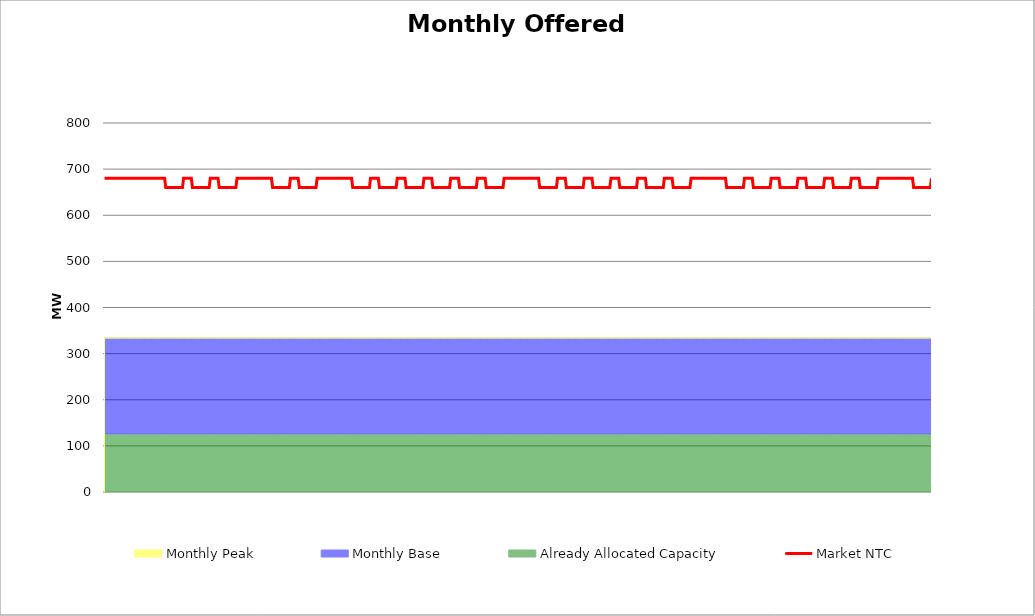
| Category | Market NTC |
|---|---|
| 0 | 680 |
| 1 | 680 |
| 2 | 680 |
| 3 | 680 |
| 4 | 680 |
| 5 | 680 |
| 6 | 680 |
| 7 | 680 |
| 8 | 680 |
| 9 | 680 |
| 10 | 680 |
| 11 | 680 |
| 12 | 680 |
| 13 | 680 |
| 14 | 680 |
| 15 | 680 |
| 16 | 680 |
| 17 | 680 |
| 18 | 680 |
| 19 | 680 |
| 20 | 680 |
| 21 | 680 |
| 22 | 680 |
| 23 | 680 |
| 24 | 680 |
| 25 | 680 |
| 26 | 680 |
| 27 | 680 |
| 28 | 680 |
| 29 | 680 |
| 30 | 680 |
| 31 | 680 |
| 32 | 680 |
| 33 | 680 |
| 34 | 680 |
| 35 | 680 |
| 36 | 680 |
| 37 | 680 |
| 38 | 680 |
| 39 | 680 |
| 40 | 680 |
| 41 | 680 |
| 42 | 680 |
| 43 | 680 |
| 44 | 680 |
| 45 | 680 |
| 46 | 680 |
| 47 | 680 |
| 48 | 680 |
| 49 | 680 |
| 50 | 680 |
| 51 | 680 |
| 52 | 680 |
| 53 | 680 |
| 54 | 680 |
| 55 | 660 |
| 56 | 660 |
| 57 | 660 |
| 58 | 660 |
| 59 | 660 |
| 60 | 660 |
| 61 | 660 |
| 62 | 660 |
| 63 | 660 |
| 64 | 660 |
| 65 | 660 |
| 66 | 660 |
| 67 | 660 |
| 68 | 660 |
| 69 | 660 |
| 70 | 660 |
| 71 | 680 |
| 72 | 680 |
| 73 | 680 |
| 74 | 680 |
| 75 | 680 |
| 76 | 680 |
| 77 | 680 |
| 78 | 680 |
| 79 | 660 |
| 80 | 660 |
| 81 | 660 |
| 82 | 660 |
| 83 | 660 |
| 84 | 660 |
| 85 | 660 |
| 86 | 660 |
| 87 | 660 |
| 88 | 660 |
| 89 | 660 |
| 90 | 660 |
| 91 | 660 |
| 92 | 660 |
| 93 | 660 |
| 94 | 660 |
| 95 | 680 |
| 96 | 680 |
| 97 | 680 |
| 98 | 680 |
| 99 | 680 |
| 100 | 680 |
| 101 | 680 |
| 102 | 680 |
| 103 | 660 |
| 104 | 660 |
| 105 | 660 |
| 106 | 660 |
| 107 | 660 |
| 108 | 660 |
| 109 | 660 |
| 110 | 660 |
| 111 | 660 |
| 112 | 660 |
| 113 | 660 |
| 114 | 660 |
| 115 | 660 |
| 116 | 660 |
| 117 | 660 |
| 118 | 660 |
| 119 | 680 |
| 120 | 680 |
| 121 | 680 |
| 122 | 680 |
| 123 | 680 |
| 124 | 680 |
| 125 | 680 |
| 126 | 680 |
| 127 | 680 |
| 128 | 680 |
| 129 | 680 |
| 130 | 680 |
| 131 | 680 |
| 132 | 680 |
| 133 | 680 |
| 134 | 680 |
| 135 | 680 |
| 136 | 680 |
| 137 | 680 |
| 138 | 680 |
| 139 | 680 |
| 140 | 680 |
| 141 | 680 |
| 142 | 680 |
| 143 | 680 |
| 144 | 680 |
| 145 | 680 |
| 146 | 680 |
| 147 | 680 |
| 148 | 680 |
| 149 | 680 |
| 150 | 680 |
| 151 | 660 |
| 152 | 660 |
| 153 | 660 |
| 154 | 660 |
| 155 | 660 |
| 156 | 660 |
| 157 | 660 |
| 158 | 660 |
| 159 | 660 |
| 160 | 660 |
| 161 | 660 |
| 162 | 660 |
| 163 | 660 |
| 164 | 660 |
| 165 | 660 |
| 166 | 660 |
| 167 | 680 |
| 168 | 680 |
| 169 | 680 |
| 170 | 680 |
| 171 | 680 |
| 172 | 680 |
| 173 | 680 |
| 174 | 680 |
| 175 | 660 |
| 176 | 660 |
| 177 | 660 |
| 178 | 660 |
| 179 | 660 |
| 180 | 660 |
| 181 | 660 |
| 182 | 660 |
| 183 | 660 |
| 184 | 660 |
| 185 | 660 |
| 186 | 660 |
| 187 | 660 |
| 188 | 660 |
| 189 | 660 |
| 190 | 660 |
| 191 | 680 |
| 192 | 680 |
| 193 | 680 |
| 194 | 680 |
| 195 | 680 |
| 196 | 680 |
| 197 | 680 |
| 198 | 680 |
| 199 | 680 |
| 200 | 680 |
| 201 | 680 |
| 202 | 680 |
| 203 | 680 |
| 204 | 680 |
| 205 | 680 |
| 206 | 680 |
| 207 | 680 |
| 208 | 680 |
| 209 | 680 |
| 210 | 680 |
| 211 | 680 |
| 212 | 680 |
| 213 | 680 |
| 214 | 680 |
| 215 | 680 |
| 216 | 680 |
| 217 | 680 |
| 218 | 680 |
| 219 | 680 |
| 220 | 680 |
| 221 | 680 |
| 222 | 680 |
| 223 | 660 |
| 224 | 660 |
| 225 | 660 |
| 226 | 660 |
| 227 | 660 |
| 228 | 660 |
| 229 | 660 |
| 230 | 660 |
| 231 | 660 |
| 232 | 660 |
| 233 | 660 |
| 234 | 660 |
| 235 | 660 |
| 236 | 660 |
| 237 | 660 |
| 238 | 660 |
| 239 | 680 |
| 240 | 680 |
| 241 | 680 |
| 242 | 680 |
| 243 | 680 |
| 244 | 680 |
| 245 | 680 |
| 246 | 680 |
| 247 | 660 |
| 248 | 660 |
| 249 | 660 |
| 250 | 660 |
| 251 | 660 |
| 252 | 660 |
| 253 | 660 |
| 254 | 660 |
| 255 | 660 |
| 256 | 660 |
| 257 | 660 |
| 258 | 660 |
| 259 | 660 |
| 260 | 660 |
| 261 | 660 |
| 262 | 660 |
| 263 | 680 |
| 264 | 680 |
| 265 | 680 |
| 266 | 680 |
| 267 | 680 |
| 268 | 680 |
| 269 | 680 |
| 270 | 680 |
| 271 | 660 |
| 272 | 660 |
| 273 | 660 |
| 274 | 660 |
| 275 | 660 |
| 276 | 660 |
| 277 | 660 |
| 278 | 660 |
| 279 | 660 |
| 280 | 660 |
| 281 | 660 |
| 282 | 660 |
| 283 | 660 |
| 284 | 660 |
| 285 | 660 |
| 286 | 660 |
| 287 | 680 |
| 288 | 680 |
| 289 | 680 |
| 290 | 680 |
| 291 | 680 |
| 292 | 680 |
| 293 | 680 |
| 294 | 680 |
| 295 | 660 |
| 296 | 660 |
| 297 | 660 |
| 298 | 660 |
| 299 | 660 |
| 300 | 660 |
| 301 | 660 |
| 302 | 660 |
| 303 | 660 |
| 304 | 660 |
| 305 | 660 |
| 306 | 660 |
| 307 | 660 |
| 308 | 660 |
| 309 | 660 |
| 310 | 660 |
| 311 | 680 |
| 312 | 680 |
| 313 | 680 |
| 314 | 680 |
| 315 | 680 |
| 316 | 680 |
| 317 | 680 |
| 318 | 680 |
| 319 | 660 |
| 320 | 660 |
| 321 | 660 |
| 322 | 660 |
| 323 | 660 |
| 324 | 660 |
| 325 | 660 |
| 326 | 660 |
| 327 | 660 |
| 328 | 660 |
| 329 | 660 |
| 330 | 660 |
| 331 | 660 |
| 332 | 660 |
| 333 | 660 |
| 334 | 660 |
| 335 | 680 |
| 336 | 680 |
| 337 | 680 |
| 338 | 680 |
| 339 | 680 |
| 340 | 680 |
| 341 | 680 |
| 342 | 680 |
| 343 | 660 |
| 344 | 660 |
| 345 | 660 |
| 346 | 660 |
| 347 | 660 |
| 348 | 660 |
| 349 | 660 |
| 350 | 660 |
| 351 | 660 |
| 352 | 660 |
| 353 | 660 |
| 354 | 660 |
| 355 | 660 |
| 356 | 660 |
| 357 | 660 |
| 358 | 660 |
| 359 | 680 |
| 360 | 680 |
| 361 | 680 |
| 362 | 680 |
| 363 | 680 |
| 364 | 680 |
| 365 | 680 |
| 366 | 680 |
| 367 | 680 |
| 368 | 680 |
| 369 | 680 |
| 370 | 680 |
| 371 | 680 |
| 372 | 680 |
| 373 | 680 |
| 374 | 680 |
| 375 | 680 |
| 376 | 680 |
| 377 | 680 |
| 378 | 680 |
| 379 | 680 |
| 380 | 680 |
| 381 | 680 |
| 382 | 680 |
| 383 | 680 |
| 384 | 680 |
| 385 | 680 |
| 386 | 680 |
| 387 | 680 |
| 388 | 680 |
| 389 | 680 |
| 390 | 680 |
| 391 | 660 |
| 392 | 660 |
| 393 | 660 |
| 394 | 660 |
| 395 | 660 |
| 396 | 660 |
| 397 | 660 |
| 398 | 660 |
| 399 | 660 |
| 400 | 660 |
| 401 | 660 |
| 402 | 660 |
| 403 | 660 |
| 404 | 660 |
| 405 | 660 |
| 406 | 660 |
| 407 | 680 |
| 408 | 680 |
| 409 | 680 |
| 410 | 680 |
| 411 | 680 |
| 412 | 680 |
| 413 | 680 |
| 414 | 680 |
| 415 | 660 |
| 416 | 660 |
| 417 | 660 |
| 418 | 660 |
| 419 | 660 |
| 420 | 660 |
| 421 | 660 |
| 422 | 660 |
| 423 | 660 |
| 424 | 660 |
| 425 | 660 |
| 426 | 660 |
| 427 | 660 |
| 428 | 660 |
| 429 | 660 |
| 430 | 660 |
| 431 | 680 |
| 432 | 680 |
| 433 | 680 |
| 434 | 680 |
| 435 | 680 |
| 436 | 680 |
| 437 | 680 |
| 438 | 680 |
| 439 | 660 |
| 440 | 660 |
| 441 | 660 |
| 442 | 660 |
| 443 | 660 |
| 444 | 660 |
| 445 | 660 |
| 446 | 660 |
| 447 | 660 |
| 448 | 660 |
| 449 | 660 |
| 450 | 660 |
| 451 | 660 |
| 452 | 660 |
| 453 | 660 |
| 454 | 660 |
| 455 | 680 |
| 456 | 680 |
| 457 | 680 |
| 458 | 680 |
| 459 | 680 |
| 460 | 680 |
| 461 | 680 |
| 462 | 680 |
| 463 | 660 |
| 464 | 660 |
| 465 | 660 |
| 466 | 660 |
| 467 | 660 |
| 468 | 660 |
| 469 | 660 |
| 470 | 660 |
| 471 | 660 |
| 472 | 660 |
| 473 | 660 |
| 474 | 660 |
| 475 | 660 |
| 476 | 660 |
| 477 | 660 |
| 478 | 660 |
| 479 | 680 |
| 480 | 680 |
| 481 | 680 |
| 482 | 680 |
| 483 | 680 |
| 484 | 680 |
| 485 | 680 |
| 486 | 680 |
| 487 | 660 |
| 488 | 660 |
| 489 | 660 |
| 490 | 660 |
| 491 | 660 |
| 492 | 660 |
| 493 | 660 |
| 494 | 660 |
| 495 | 660 |
| 496 | 660 |
| 497 | 660 |
| 498 | 660 |
| 499 | 660 |
| 500 | 660 |
| 501 | 660 |
| 502 | 660 |
| 503 | 680 |
| 504 | 680 |
| 505 | 680 |
| 506 | 680 |
| 507 | 680 |
| 508 | 680 |
| 509 | 680 |
| 510 | 680 |
| 511 | 660 |
| 512 | 660 |
| 513 | 660 |
| 514 | 660 |
| 515 | 660 |
| 516 | 660 |
| 517 | 660 |
| 518 | 660 |
| 519 | 660 |
| 520 | 660 |
| 521 | 660 |
| 522 | 660 |
| 523 | 660 |
| 524 | 660 |
| 525 | 660 |
| 526 | 660 |
| 527 | 680 |
| 528 | 680 |
| 529 | 680 |
| 530 | 680 |
| 531 | 680 |
| 532 | 680 |
| 533 | 680 |
| 534 | 680 |
| 535 | 680 |
| 536 | 680 |
| 537 | 680 |
| 538 | 680 |
| 539 | 680 |
| 540 | 680 |
| 541 | 680 |
| 542 | 680 |
| 543 | 680 |
| 544 | 680 |
| 545 | 680 |
| 546 | 680 |
| 547 | 680 |
| 548 | 680 |
| 549 | 680 |
| 550 | 680 |
| 551 | 680 |
| 552 | 680 |
| 553 | 680 |
| 554 | 680 |
| 555 | 680 |
| 556 | 680 |
| 557 | 680 |
| 558 | 680 |
| 559 | 660 |
| 560 | 660 |
| 561 | 660 |
| 562 | 660 |
| 563 | 660 |
| 564 | 660 |
| 565 | 660 |
| 566 | 660 |
| 567 | 660 |
| 568 | 660 |
| 569 | 660 |
| 570 | 660 |
| 571 | 660 |
| 572 | 660 |
| 573 | 660 |
| 574 | 660 |
| 575 | 680 |
| 576 | 680 |
| 577 | 680 |
| 578 | 680 |
| 579 | 680 |
| 580 | 680 |
| 581 | 680 |
| 582 | 680 |
| 583 | 660 |
| 584 | 660 |
| 585 | 660 |
| 586 | 660 |
| 587 | 660 |
| 588 | 660 |
| 589 | 660 |
| 590 | 660 |
| 591 | 660 |
| 592 | 660 |
| 593 | 660 |
| 594 | 660 |
| 595 | 660 |
| 596 | 660 |
| 597 | 660 |
| 598 | 660 |
| 599 | 680 |
| 600 | 680 |
| 601 | 680 |
| 602 | 680 |
| 603 | 680 |
| 604 | 680 |
| 605 | 680 |
| 606 | 680 |
| 607 | 660 |
| 608 | 660 |
| 609 | 660 |
| 610 | 660 |
| 611 | 660 |
| 612 | 660 |
| 613 | 660 |
| 614 | 660 |
| 615 | 660 |
| 616 | 660 |
| 617 | 660 |
| 618 | 660 |
| 619 | 660 |
| 620 | 660 |
| 621 | 660 |
| 622 | 660 |
| 623 | 680 |
| 624 | 680 |
| 625 | 680 |
| 626 | 680 |
| 627 | 680 |
| 628 | 680 |
| 629 | 680 |
| 630 | 680 |
| 631 | 660 |
| 632 | 660 |
| 633 | 660 |
| 634 | 660 |
| 635 | 660 |
| 636 | 660 |
| 637 | 660 |
| 638 | 660 |
| 639 | 660 |
| 640 | 660 |
| 641 | 660 |
| 642 | 660 |
| 643 | 660 |
| 644 | 660 |
| 645 | 660 |
| 646 | 660 |
| 647 | 680 |
| 648 | 680 |
| 649 | 680 |
| 650 | 680 |
| 651 | 680 |
| 652 | 680 |
| 653 | 680 |
| 654 | 680 |
| 655 | 660 |
| 656 | 660 |
| 657 | 660 |
| 658 | 660 |
| 659 | 660 |
| 660 | 660 |
| 661 | 660 |
| 662 | 660 |
| 663 | 660 |
| 664 | 660 |
| 665 | 660 |
| 666 | 660 |
| 667 | 660 |
| 668 | 660 |
| 669 | 660 |
| 670 | 660 |
| 671 | 680 |
| 672 | 680 |
| 673 | 680 |
| 674 | 680 |
| 675 | 680 |
| 676 | 680 |
| 677 | 680 |
| 678 | 680 |
| 679 | 660 |
| 680 | 660 |
| 681 | 660 |
| 682 | 660 |
| 683 | 660 |
| 684 | 660 |
| 685 | 660 |
| 686 | 660 |
| 687 | 660 |
| 688 | 660 |
| 689 | 660 |
| 690 | 660 |
| 691 | 660 |
| 692 | 660 |
| 693 | 660 |
| 694 | 660 |
| 695 | 680 |
| 696 | 680 |
| 697 | 680 |
| 698 | 680 |
| 699 | 680 |
| 700 | 680 |
| 701 | 680 |
| 702 | 680 |
| 703 | 680 |
| 704 | 680 |
| 705 | 680 |
| 706 | 680 |
| 707 | 680 |
| 708 | 680 |
| 709 | 680 |
| 710 | 680 |
| 711 | 680 |
| 712 | 680 |
| 713 | 680 |
| 714 | 680 |
| 715 | 680 |
| 716 | 680 |
| 717 | 680 |
| 718 | 680 |
| 719 | 680 |
| 720 | 680 |
| 721 | 680 |
| 722 | 680 |
| 723 | 680 |
| 724 | 680 |
| 725 | 680 |
| 726 | 680 |
| 727 | 660 |
| 728 | 660 |
| 729 | 660 |
| 730 | 660 |
| 731 | 660 |
| 732 | 660 |
| 733 | 660 |
| 734 | 660 |
| 735 | 660 |
| 736 | 660 |
| 737 | 660 |
| 738 | 660 |
| 739 | 660 |
| 740 | 660 |
| 741 | 660 |
| 742 | 660 |
| 743 | 680 |